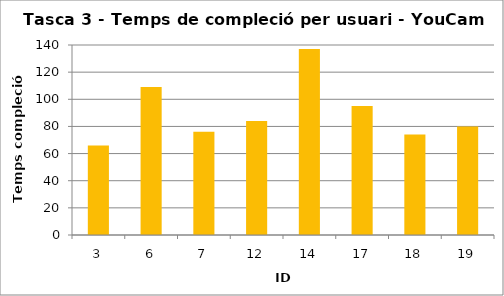
| Category | Temps de compleció (s) |
|---|---|
| 3.0 | 66 |
| 6.0 | 109 |
| 7.0 | 76 |
| 12.0 | 84 |
| 14.0 | 137 |
| 17.0 | 95 |
| 18.0 | 74 |
| 19.0 | 80 |